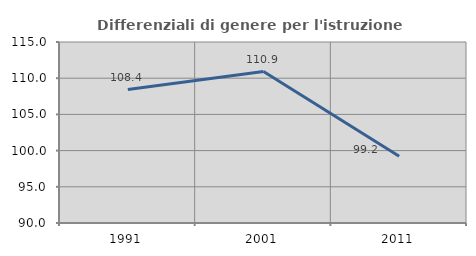
| Category | Differenziali di genere per l'istruzione superiore |
|---|---|
| 1991.0 | 108.431 |
| 2001.0 | 110.921 |
| 2011.0 | 99.209 |